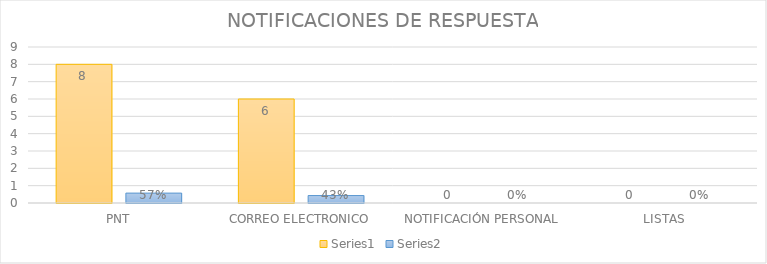
| Category | Series 3 | Series 4 |
|---|---|---|
| PNT | 8 | 0.571 |
| CORREO ELECTRONICO | 6 | 0.429 |
| NOTIFICACIÓN PERSONAL | 0 | 0 |
| LISTAS | 0 | 0 |